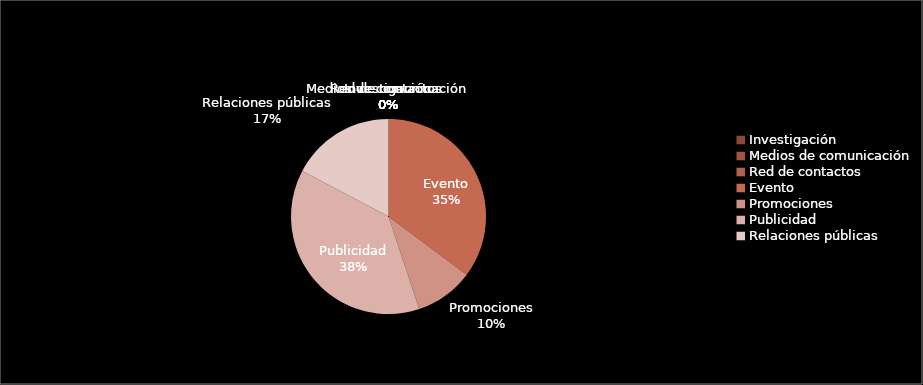
| Category | Series 0 | Series 1 |
|---|---|---|
| Investigación | 0 |  |
| Medios de comunicación | 0 |  |
| Red de contactos | 0 |  |
| Evento | 6515.416 |  |
| Promociones | 1800 |  |
| Publicidad | 7007 |  |
| Relaciones públicas | 3200 |  |